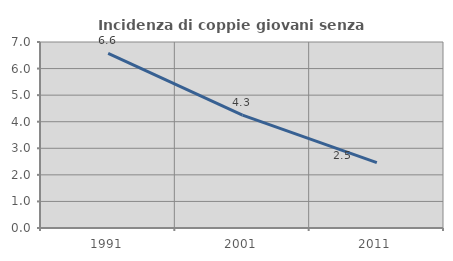
| Category | Incidenza di coppie giovani senza figli |
|---|---|
| 1991.0 | 6.569 |
| 2001.0 | 4.25 |
| 2011.0 | 2.463 |